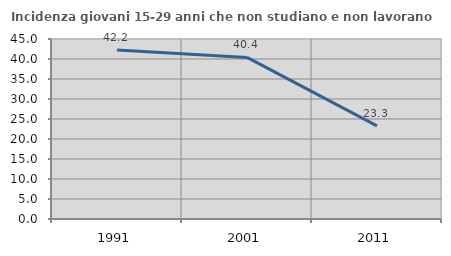
| Category | Incidenza giovani 15-29 anni che non studiano e non lavorano  |
|---|---|
| 1991.0 | 42.222 |
| 2001.0 | 40.397 |
| 2011.0 | 23.288 |